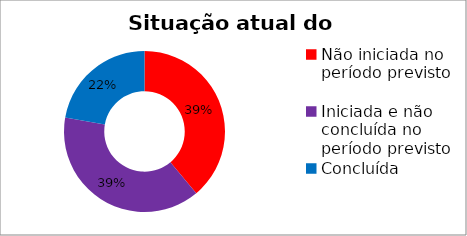
| Category | Series 0 |
|---|---|
| Não iniciada no período previsto | 0.389 |
| Iniciada e não concluída no período previsto | 0.389 |
| Concluída | 0.222 |